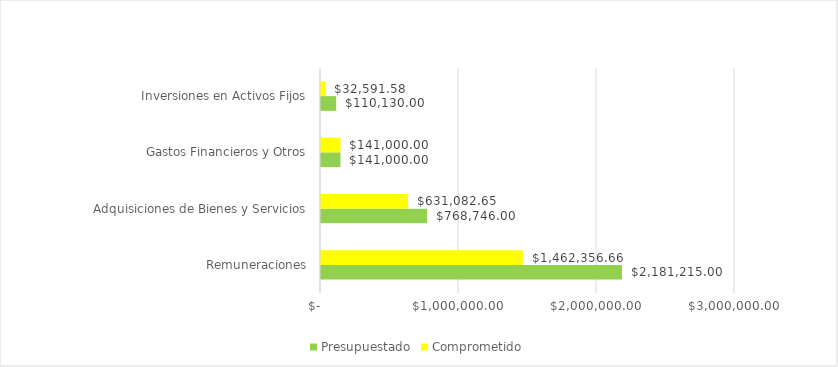
| Category |  Presupuestado  |  Comprometido  |
|---|---|---|
| Remuneraciones | 2181215 | 1462356.66 |
| Adquisiciones de Bienes y Servicios | 768746 | 631082.65 |
| Gastos Financieros y Otros | 141000 | 141000 |
| Inversiones en Activos Fijos | 110130 | 32591.58 |